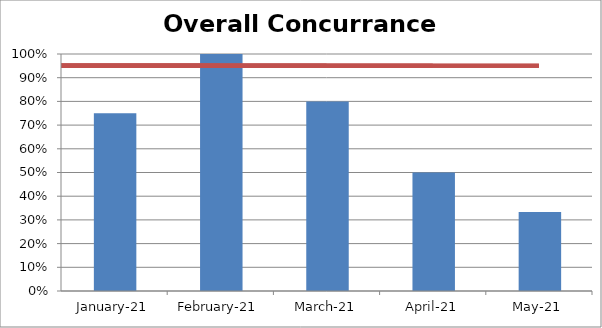
| Category | Concurrence Rate |
|---|---|
| 2021-01-01 | 0.75 |
| nan | 1 |
| 2021-02-01 | 1 |
| nan | 0.75 |
| 2021-03-01 | 0.8 |
| nan | 0.6 |
| 2021-04-01 | 0.5 |
| nan | 1 |
| 2021-05-01 | 0.333 |
| nan | 0.8 |